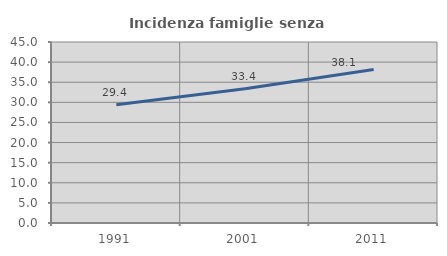
| Category | Incidenza famiglie senza nuclei |
|---|---|
| 1991.0 | 29.395 |
| 2001.0 | 33.374 |
| 2011.0 | 38.14 |